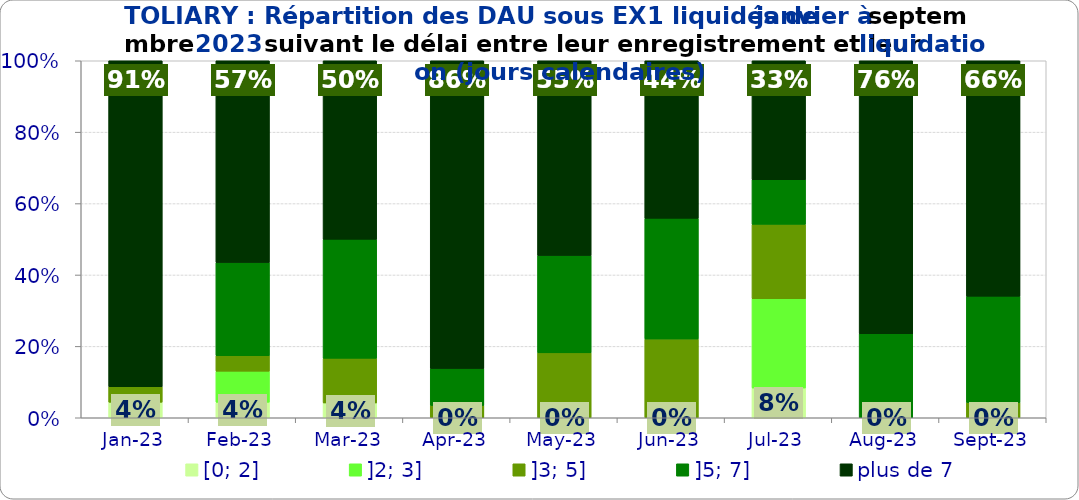
| Category | [0; 2] | ]2; 3] | ]3; 5] | ]5; 7] | plus de 7 |
|---|---|---|---|---|---|
| 2023-01-01 | 0.043 | 0 | 0.043 | 0 | 0.913 |
| 2023-02-01 | 0.043 | 0.087 | 0.043 | 0.261 | 0.565 |
| 2023-03-01 | 0.042 | 0 | 0.125 | 0.333 | 0.5 |
| 2023-04-01 | 0 | 0 | 0.034 | 0.103 | 0.862 |
| 2023-05-01 | 0 | 0 | 0.182 | 0.273 | 0.545 |
| 2023-06-01 | 0 | 0 | 0.221 | 0.338 | 0.441 |
| 2023-07-01 | 0.083 | 0.25 | 0.208 | 0.125 | 0.333 |
| 2023-08-01 | 0 | 0 | 0 | 0.235 | 0.765 |
| 2023-09-01 | 0 | 0 | 0.043 | 0.298 | 0.66 |